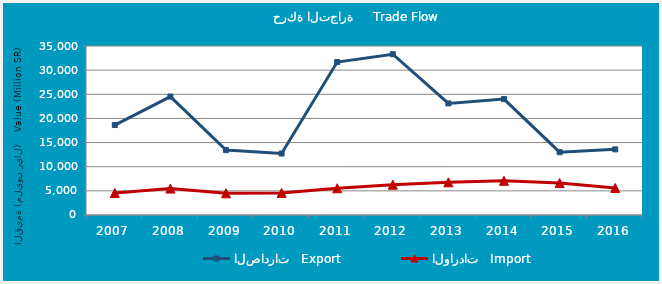
| Category | الصادرات   Export | الواردات   Import |
|---|---|---|
| 2007.0 | 18630.001 | 4551.59 |
| 2008.0 | 24528.715 | 5478.731 |
| 2009.0 | 13436.464 | 4493.896 |
| 2010.0 | 12730.068 | 4581.696 |
| 2011.0 | 31667.009 | 5534.253 |
| 2012.0 | 33297.933 | 6273.872 |
| 2013.0 | 23113.451 | 6771.46 |
| 2014.0 | 24000.195 | 7088.807 |
| 2015.0 | 13006.961 | 6616.347 |
| 2016.0 | 13594.865 | 5593.917 |